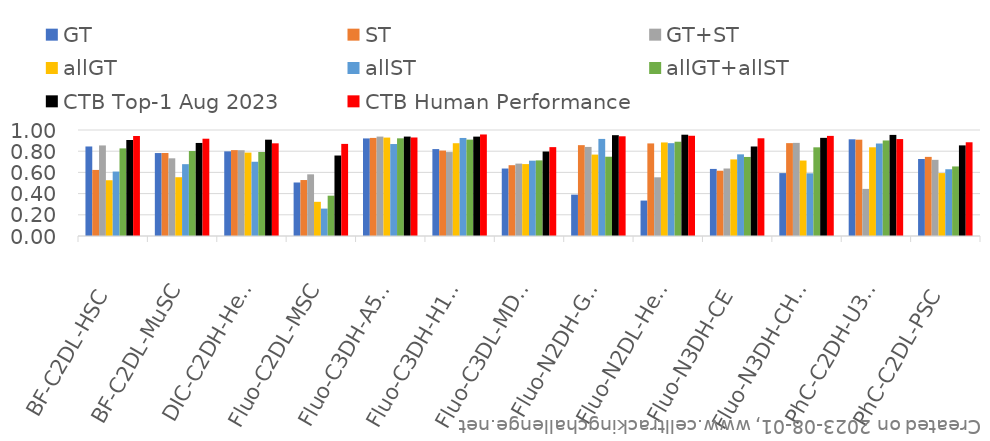
| Category | GT | ST | GT+ST | allGT | allST | allGT+allST | CTB Top-1 Aug 2023 | CTB Human Performance |
|---|---|---|---|---|---|---|---|---|
| BF-C2DL-HSC | 0.845 | 0.623 | 0.854 | 0.526 | 0.608 | 0.826 | 0.906 | 0.944 |
| BF-C2DL-MuSC | 0.783 | 0.783 | 0.733 | 0.554 | 0.678 | 0.802 | 0.878 | 0.918 |
| DIC-C2DH-HeLa | 0.798 | 0.81 | 0.809 | 0.787 | 0.7 | 0.793 | 0.909 | 0.874 |
| Fluo-C2DL-MSC | 0.505 | 0.528 | 0.582 | 0.323 | 0.259 | 0.38 | 0.759 | 0.869 |
| Fluo-C3DH-A549 | 0.921 | 0.925 | 0.938 | 0.929 | 0.868 | 0.921 | 0.938 | 0.929 |
| Fluo-C3DH-H157 | 0.82 | 0.806 | 0.792 | 0.875 | 0.925 | 0.909 | 0.938 | 0.958 |
| Fluo-C3DL-MDA231 | 0.636 | 0.668 | 0.683 | 0.678 | 0.711 | 0.713 | 0.797 | 0.838 |
| Fluo-N2DH-GOWT1 | 0.39 | 0.857 | 0.84 | 0.768 | 0.916 | 0.748 | 0.951 | 0.941 |
| Fluo-N2DL-HeLa | 0.334 | 0.873 | 0.554 | 0.883 | 0.876 | 0.889 | 0.956 | 0.946 |
| Fluo-N3DH-CE | 0.633 | 0.616 | 0.637 | 0.722 | 0.77 | 0.746 | 0.844 | 0.922 |
| Fluo-N3DH-CHO | 0.593 | 0.876 | 0.879 | 0.712 | 0.591 | 0.837 | 0.926 | 0.944 |
| PhC-C2DH-U373 | 0.912 | 0.909 | 0.444 | 0.837 | 0.872 | 0.901 | 0.954 | 0.914 |
| PhC-C2DL-PSC | 0.727 | 0.746 | 0.719 | 0.593 | 0.63 | 0.656 | 0.855 | 0.884 |